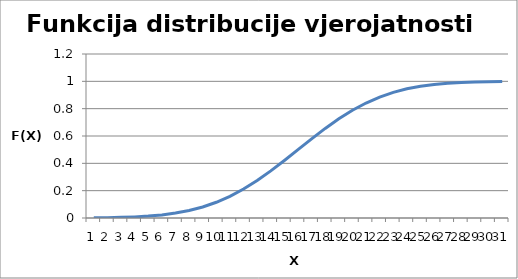
| Category | Series 0 |
|---|---|
| 0 | 0.001 |
| 1 | 0.003 |
| 2 | 0.005 |
| 3 | 0.008 |
| 4 | 0.014 |
| 5 | 0.023 |
| 6 | 0.036 |
| 7 | 0.055 |
| 8 | 0.081 |
| 9 | 0.115 |
| 10 | 0.159 |
| 11 | 0.212 |
| 12 | 0.274 |
| 13 | 0.345 |
| 14 | 0.421 |
| 15 | 0.5 |
| 16 | 0.579 |
| 17 | 0.655 |
| 18 | 0.726 |
| 19 | 0.788 |
| 20 | 0.841 |
| 21 | 0.885 |
| 22 | 0.919 |
| 23 | 0.945 |
| 24 | 0.964 |
| 25 | 0.977 |
| 26 | 0.986 |
| 27 | 0.992 |
| 28 | 0.995 |
| 29 | 0.997 |
| 30 | 0.999 |